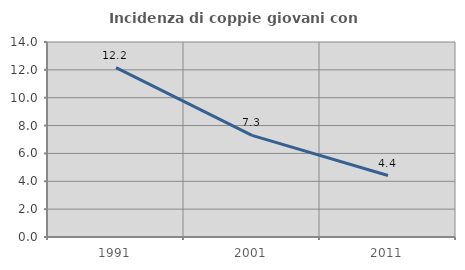
| Category | Incidenza di coppie giovani con figli |
|---|---|
| 1991.0 | 12.161 |
| 2001.0 | 7.296 |
| 2011.0 | 4.415 |